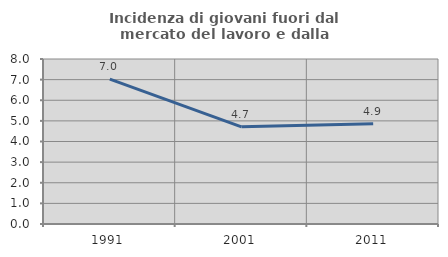
| Category | Incidenza di giovani fuori dal mercato del lavoro e dalla formazione  |
|---|---|
| 1991.0 | 7.02 |
| 2001.0 | 4.711 |
| 2011.0 | 4.867 |